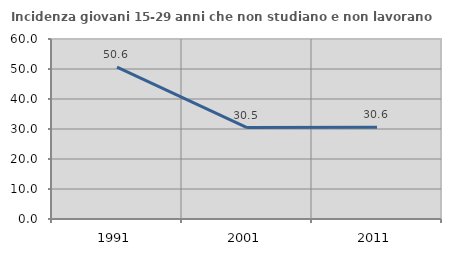
| Category | Incidenza giovani 15-29 anni che non studiano e non lavorano  |
|---|---|
| 1991.0 | 50.62 |
| 2001.0 | 30.46 |
| 2011.0 | 30.556 |